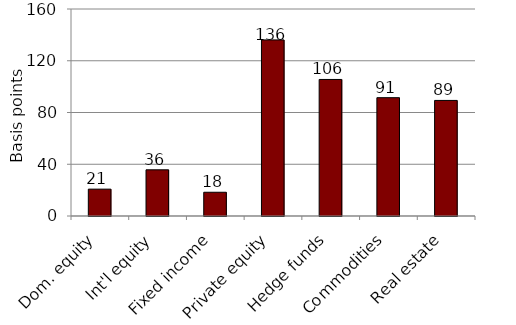
| Category | Series 0 |
|---|---|
| Dom. equity | 20.749 |
| Int'l equity | 35.689 |
| Fixed income | 18.35 |
| Private equity | 136.11 |
| Hedge funds | 105.534 |
| Commodities | 91.458 |
| Real estate | 89.328 |